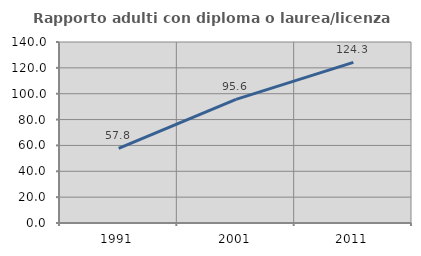
| Category | Rapporto adulti con diploma o laurea/licenza media  |
|---|---|
| 1991.0 | 57.801 |
| 2001.0 | 95.575 |
| 2011.0 | 124.251 |